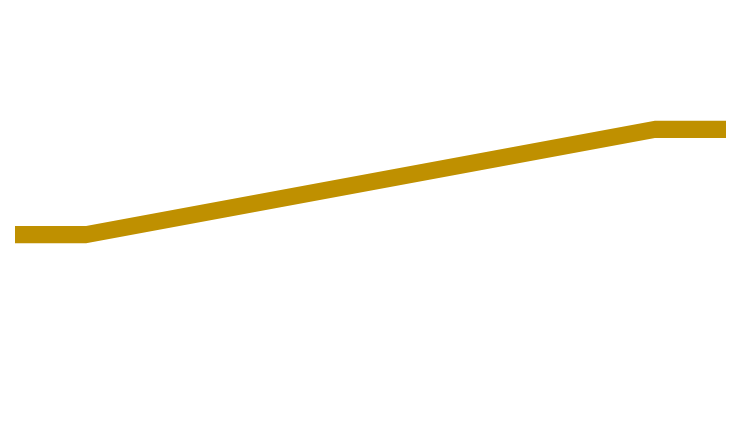
| Category | Series 0 | Series 1 | Series 2 |
|---|---|---|---|
| 0.0 | 2030.637 | 167.151 | 1815.372 |
| 10.0 | 2030.637 | 167.151 | 1815.372 |
| 90.0 | 1017.189 | 167.151 | 2828.821 |
| 100.0 | 1017.189 | 167.151 | 2828.821 |